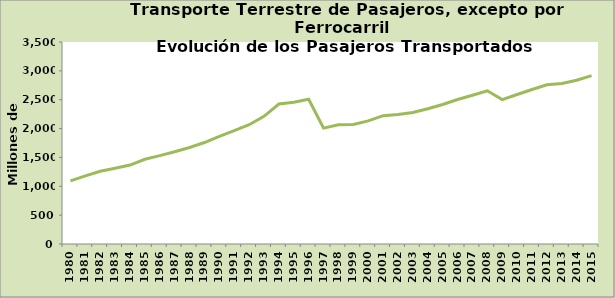
| Category | Series 0 |
|---|---|
| 1980.0 | 1094 |
| 1981.0 | 1180 |
| 1982.0 | 1261 |
| 1983.0 | 1312 |
| 1984.0 | 1368 |
| 1985.0 | 1468 |
| 1986.0 | 1531 |
| 1987.0 | 1599 |
| 1988.0 | 1673 |
| 1989.0 | 1758 |
| 1990.0 | 1865 |
| 1991.0 | 1965 |
| 1992.0 | 2066 |
| 1993.0 | 2212 |
| 1994.0 | 2426 |
| 1995.0 | 2457 |
| 1996.0 | 2509 |
| 1997.0 | 2008 |
| 1998.0 | 2065 |
| 1999.0 | 2070 |
| 2000.0 | 2134 |
| 2001.0 | 2224 |
| 2002.0 | 2245 |
| 2003.0 | 2279 |
| 2004.0 | 2344 |
| 2005.0 | 2418 |
| 2006.0 | 2503 |
| 2007.0 | 2578 |
| 2008.0 | 2655 |
| 2009.0 | 2501 |
| 2010.0 | 2591 |
| 2011.0 | 2677 |
| 2012.0 | 2758 |
| 2013.0 | 2781 |
| 2014.0 | 2836.795 |
| 2015.0 | 2918 |